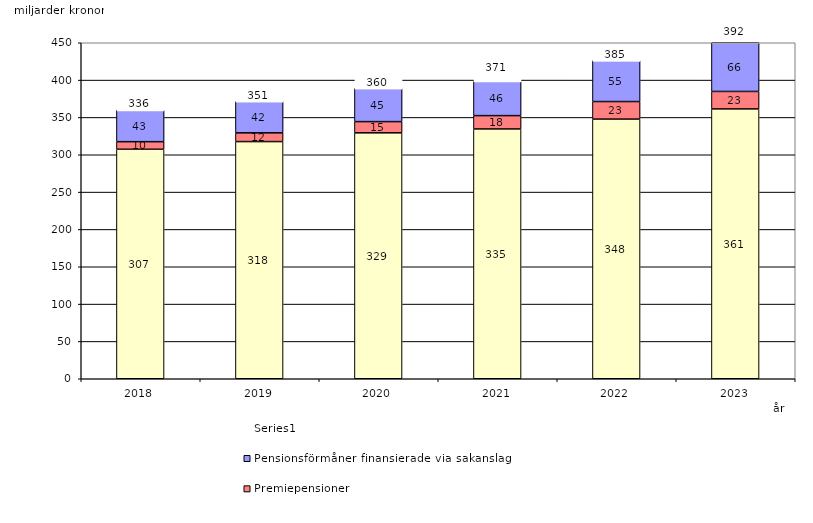
| Category | Inkomstpension och tilläggspension m.m. | Premiepensioner | Pensionsförmåner finansierade via sakanslag | Series 0 |
|---|---|---|---|---|
| 2018.0 | 307.356 | 10.141 | 42.55 | 20 |
| 2019.0 | 317.628 | 11.715 | 42.22 | 20 |
| 2020.0 | 329.365 | 15.016 | 44.546 | 20 |
| 2021.0 | 334.563 | 17.837 | 46.327 | 20 |
| 2022.0 | 347.77 | 23.477 | 55.057 | 20 |
| 2023.0 | 361.396 | 23.388 | 65.805 | 20 |